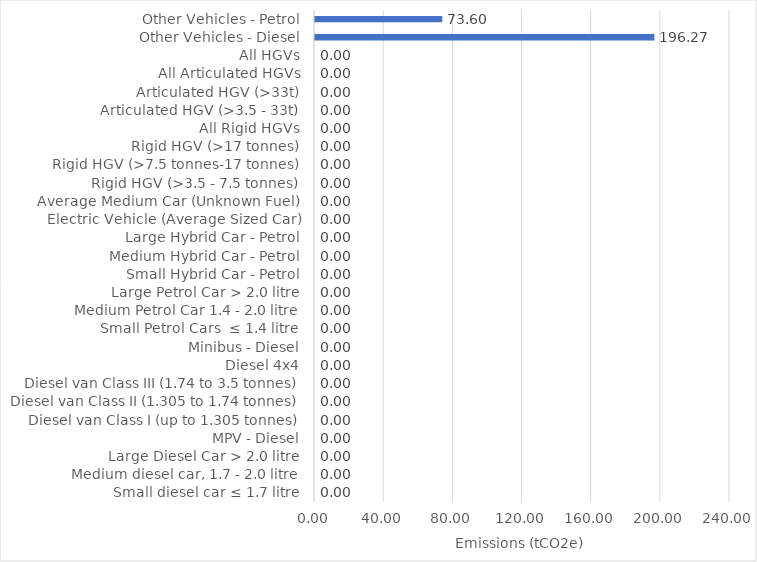
| Category | Emissions
(tCO2e) |
|---|---|
| Small diesel car ≤ 1.7 litre | 0 |
| Medium diesel car, 1.7 - 2.0 litre | 0 |
| Large Diesel Car > 2.0 litre | 0 |
| MPV - Diesel | 0 |
| Diesel van Class I (up to 1.305 tonnes) | 0 |
| Diesel van Class II (1.305 to 1.74 tonnes) | 0 |
| Diesel van Class III (1.74 to 3.5 tonnes) | 0 |
| Diesel 4x4 | 0 |
| Minibus - Diesel | 0 |
| Small Petrol Cars  ≤ 1.4 litre | 0 |
| Medium Petrol Car 1.4 - 2.0 litre | 0 |
| Large Petrol Car > 2.0 litre | 0 |
| Small Hybrid Car - Petrol | 0 |
| Medium Hybrid Car - Petrol | 0 |
| Large Hybrid Car - Petrol | 0 |
| Electric Vehicle (Average Sized Car) | 0 |
| Average Medium Car (Unknown Fuel) | 0 |
| Rigid HGV (>3.5 - 7.5 tonnes) | 0 |
| Rigid HGV (>7.5 tonnes-17 tonnes) | 0 |
| Rigid HGV (>17 tonnes) | 0 |
| All Rigid HGVs | 0 |
| Articulated HGV (>3.5 - 33t) | 0 |
| Articulated HGV (>33t) | 0 |
| All Articulated HGVs | 0 |
| All HGVs | 0 |
| Other Vehicles - Diesel | 196.269 |
| Other Vehicles - Petrol | 73.598 |